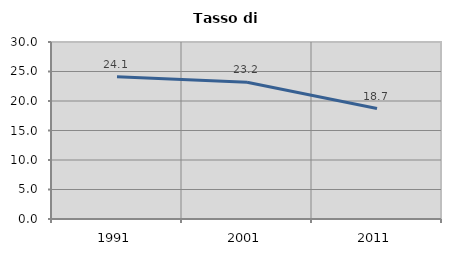
| Category | Tasso di disoccupazione   |
|---|---|
| 1991.0 | 24.131 |
| 2001.0 | 23.179 |
| 2011.0 | 18.724 |